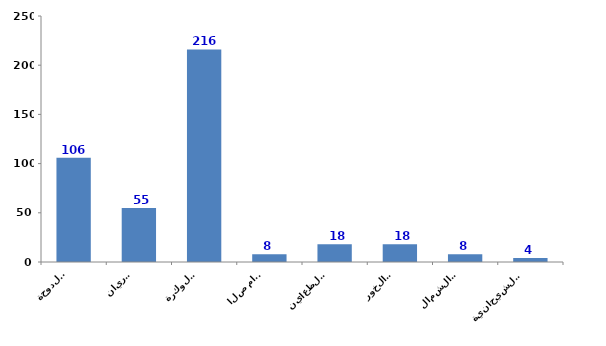
| Category | Series 0 |
|---|---|
| الدوحة
Doha | 106 |
| الريان
Rayyan | 55 |
| الوكرة
Wakrah | 216 |
| ام صلال
Umm Slal | 8 |
| الظعاين
Al-Daayen | 18 |
| الخور
Al-Khor | 18 |
| الشمال
Al-Shamal | 8 |
| الشيحانية
Al-Shahhaniya | 4 |